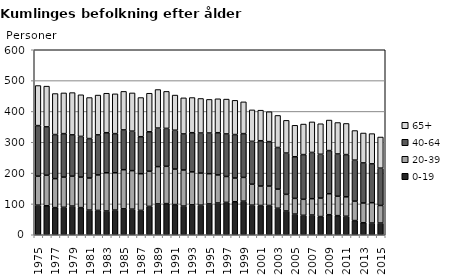
| Category | 0-19 | 20-39 | 40-64 | 65+ |
|---|---|---|---|---|
| 1975.0 | 96 | 94 | 164 | 130 |
| 1976.0 | 94 | 99 | 157 | 132 |
| 1977.0 | 88 | 94 | 143 | 133 |
| 1978.0 | 89 | 98 | 141 | 132 |
| 1979.0 | 93 | 97 | 134 | 137 |
| 1980.0 | 88 | 99 | 132 | 135 |
| 1981.0 | 80 | 104 | 128 | 133 |
| 1982.0 | 79 | 115 | 130 | 129 |
| 1983.0 | 77 | 124 | 130 | 128 |
| 1984.0 | 80 | 121 | 127 | 129 |
| 1985.0 | 84 | 127 | 129 | 125 |
| 1986.0 | 83 | 125 | 128 | 124 |
| 1987.0 | 79 | 119 | 120 | 127 |
| 1988.0 | 92 | 114 | 128 | 125 |
| 1989.0 | 100 | 121 | 125 | 125 |
| 1990.0 | 101 | 121 | 123 | 120 |
| 1991.0 | 98 | 115 | 126 | 114 |
| 1992.0 | 93 | 117 | 117 | 117 |
| 1993.0 | 97 | 107 | 127 | 114 |
| 1994.0 | 96 | 104 | 130 | 112 |
| 1995.0 | 100 | 98 | 132 | 109 |
| 1996.0 | 103 | 91 | 137 | 110 |
| 1997.0 | 105 | 84 | 138 | 113 |
| 1998.0 | 107 | 77 | 141 | 111 |
| 1999.0 | 109 | 77 | 142 | 103 |
| 2000.0 | 96 | 68 | 139 | 102 |
| 2001.0 | 95 | 63 | 147 | 99 |
| 2002.0 | 95 | 63 | 144 | 97 |
| 2003.0 | 86 | 62 | 135 | 104 |
| 2004.0 | 77 | 54 | 134 | 106 |
| 2005.0 | 67 | 51 | 135 | 102 |
| 2006.0 | 63 | 52 | 145 | 99 |
| 2007.0 | 64 | 53 | 150 | 99 |
| 2008.0 | 59 | 60 | 142 | 99 |
| 2009.0 | 65 | 68 | 140 | 99 |
| 2010.0 | 62 | 63 | 137 | 102 |
| 2011.0 | 60 | 63 | 137 | 101 |
| 2012.0 | 46 | 63 | 133 | 96 |
| 2013.0 | 39 | 64 | 130 | 97 |
| 2014.0 | 38 | 66 | 126 | 98 |
| 2015.0 | 38 | 57 | 121 | 101 |